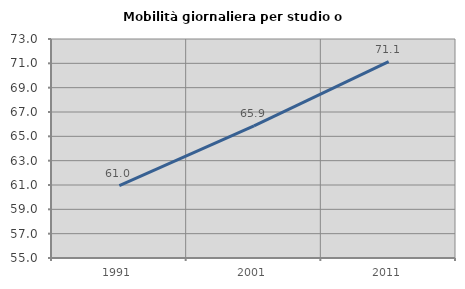
| Category | Mobilità giornaliera per studio o lavoro |
|---|---|
| 1991.0 | 60.954 |
| 2001.0 | 65.857 |
| 2011.0 | 71.143 |